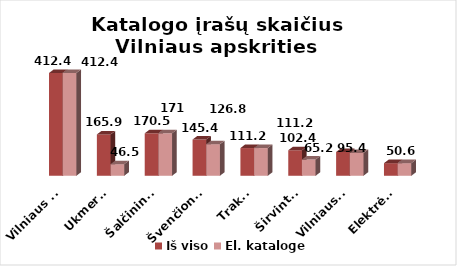
| Category | Iš viso | El. kataloge |
|---|---|---|
| Vilniaus m. | 412.4 | 412.4 |
| Ukmergė | 165.9 | 46.5 |
| Šalčininkai | 170.5 | 170.5 |
| Švenčionys | 145.4 | 126.8 |
| Trakai | 111.2 | 111.2 |
| Širvintos | 102.4 | 65.2 |
| Vilniaus r. | 95.4 | 91.5 |
| Elektrėnai | 50.6 | 50.6 |